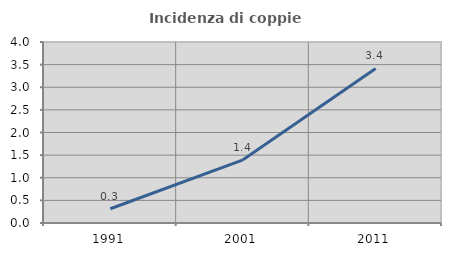
| Category | Incidenza di coppie miste |
|---|---|
| 1991.0 | 0.314 |
| 2001.0 | 1.397 |
| 2011.0 | 3.416 |